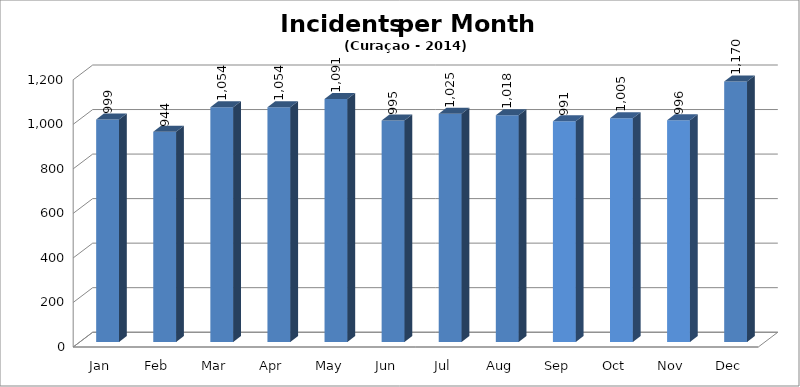
| Category | Series 0 |
|---|---|
| Jan | 999 |
| Feb | 944 |
| Mar | 1054 |
| Apr | 1054 |
| May | 1091 |
| Jun | 995 |
| Jul | 1025 |
| Aug | 1018 |
| Sep | 991 |
| Oct | 1005 |
| Nov | 996 |
| Dec | 1170 |